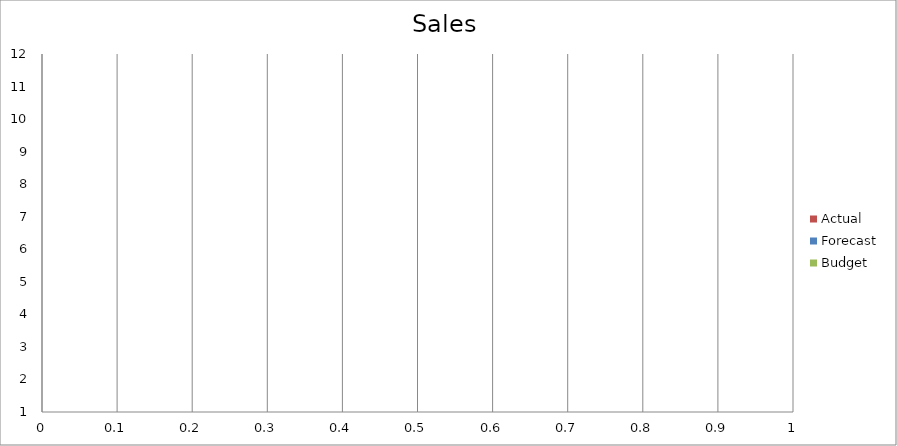
| Category | Budget | Forecast | Actual |
|---|---|---|---|
| 0 | 3050 | 3050 | 870 |
| 1 | 2790 | 1550 | 1040 |
| 2 | 2230 | 2860 | 1390 |
| 3 | 2610 | 2500 | 1580 |
| 4 | 840 | 2710 | 1460 |
| 5 | 3050 | 2940 | 2070 |
| 6 | 2700 | 3420 | 2890 |
| 7 | 2200 | 840 | 1430 |
| 8 | 3010 | 2700 | 2820 |
| 9 | 2250 | 2090 | 2110 |
| 10 | 3460 | 1880 | 2130 |
| 11 | 1960 | 870 | 580 |